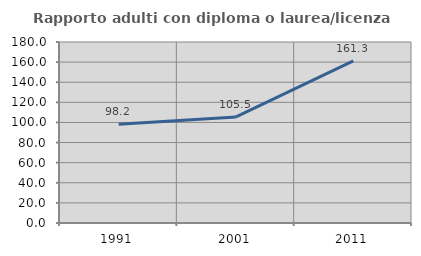
| Category | Rapporto adulti con diploma o laurea/licenza media  |
|---|---|
| 1991.0 | 98.157 |
| 2001.0 | 105.512 |
| 2011.0 | 161.302 |